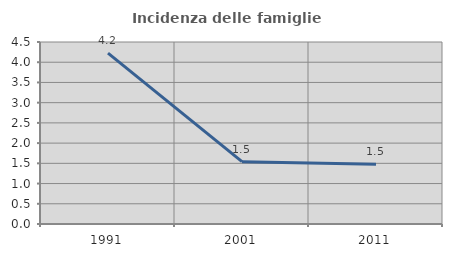
| Category | Incidenza delle famiglie numerose |
|---|---|
| 1991.0 | 4.225 |
| 2001.0 | 1.542 |
| 2011.0 | 1.477 |